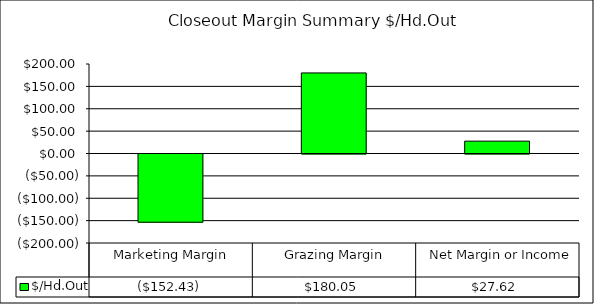
| Category | $/Hd.Out |
|---|---|
| Marketing Margin | -152.433 |
| Grazing Margin | 180.05 |
|  Net Margin or Income | 27.616 |